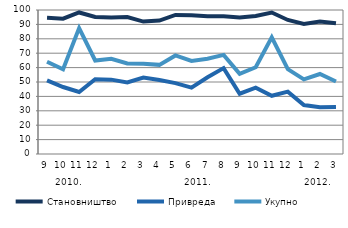
| Category | Становништво | Привреда | Укупно |
|---|---|---|---|
| 0 | 94.556 | 51.165 | 64.107 |
| 1 | 93.949 | 46.513 | 58.789 |
| 2 | 98.277 | 43.054 | 87.402 |
| 3 | 95.117 | 51.885 | 64.936 |
| 4 | 94.707 | 51.648 | 66.172 |
| 5 | 95.12 | 49.726 | 62.91 |
| 6 | 91.952 | 53.035 | 62.743 |
| 7 | 92.687 | 51.437 | 61.907 |
| 8 | 96.602 | 49.198 | 68.431 |
| 9 | 96.383 | 46.041 | 64.626 |
| 10 | 95.604 | 53.303 | 66.135 |
| 11 | 95.618 | 59.637 | 68.805 |
| 12 | 94.826 | 41.864 | 55.651 |
| 13 | 95.888 | 46.023 | 60.25 |
| 14 | 98.245 | 40.441 | 80.979 |
| 15 | 93.08 | 43.288 | 58.907 |
| 16 | 90.326 | 34.018 | 51.85 |
| 17 | 92.03 | 32.545 | 55.563 |
| 18 | 90.727 | 32.642 | 50.369 |